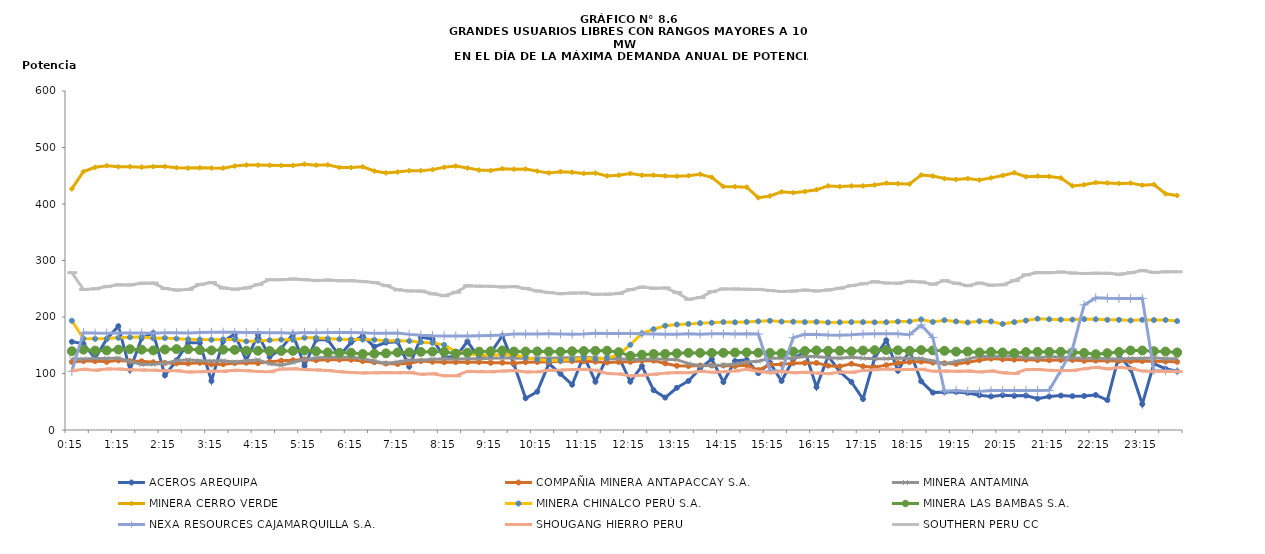
| Category | ACEROS AREQUIPA | COMPAÑIA MINERA ANTAPACCAY S.A. | MINERA ANTAMINA | MINERA CERRO VERDE | MINERA CHINALCO PERÚ S.A. | MINERA LAS BAMBAS S.A. | NEXA RESOURCES CAJAMARQUILLA S.A. | SHOUGANG HIERRO PERU | SOUTHERN PERU CC |
|---|---|---|---|---|---|---|---|---|---|
| 2013-03-14 00:15:00 | 156.19 | 120.55 | 125.65 | 426.71 | 193.35 | 139.48 | 103.99 | 105.05 | 278.43 |
| 2013-03-14 00:30:00 | 152.95 | 122.13 | 125.59 | 457.32 | 161.76 | 142.19 | 172.27 | 107.53 | 248.56 |
| 2013-03-14 00:45:00 | 126.42 | 121.96 | 126.39 | 464.91 | 161.42 | 140.56 | 171.52 | 105.78 | 249.96 |
| 2013-03-14 01:00:00 | 161.11 | 120.61 | 126.63 | 467.75 | 161.8 | 140.8 | 171.46 | 108.13 | 253.76 |
| 2013-03-14 01:15:00 | 183.74 | 123.22 | 127.4 | 466.04 | 163.17 | 142.27 | 171.75 | 107.87 | 257.07 |
| 2013-03-14 01:30:00 | 106.52 | 121.72 | 121.48 | 465.92 | 164.23 | 143.01 | 171.68 | 106.56 | 256.84 |
| 2013-03-14 01:45:00 | 162.17 | 121.72 | 116.07 | 465.22 | 164.5 | 142.21 | 171.57 | 106.04 | 259.85 |
| 2013-03-14 02:00:00 | 171.76 | 119.89 | 116.27 | 466.17 | 162.21 | 140.84 | 171.4 | 105.89 | 260.01 |
| 2013-03-14 02:15:00 | 96.72 | 118.86 | 118.07 | 466.47 | 162.93 | 142.43 | 172.02 | 104.96 | 250.38 |
| 2013-03-14 02:30:00 | 123.28 | 117.89 | 122.46 | 464.32 | 161.72 | 143.18 | 172.19 | 104.72 | 247.6 |
| 2013-03-14 02:45:00 | 154.51 | 117.76 | 124.16 | 463.55 | 160.73 | 142.98 | 171.48 | 102.72 | 248.86 |
| 2013-03-14 03:00:00 | 154.22 | 119.07 | 122.7 | 464.19 | 160.21 | 141.53 | 172.69 | 103.11 | 257.44 |
| 2013-03-14 03:15:00 | 86.91 | 116.09 | 122.02 | 463.59 | 159.76 | 140.89 | 172.8 | 103.84 | 261.07 |
| 2013-03-14 03:30:00 | 157.03 | 116.47 | 122.56 | 463.48 | 160.36 | 142.25 | 173.09 | 103.78 | 251.37 |
| 2013-03-14 03:45:00 | 169.61 | 118.28 | 120.3 | 467.12 | 160.21 | 141.85 | 172.89 | 105.71 | 249.28 |
| 2013-03-14 04:00:00 | 123.09 | 119.14 | 122.68 | 468.93 | 156.83 | 140.39 | 172.65 | 104.86 | 251.47 |
| 2013-03-14 04:15:00 | 168.83 | 118.37 | 124.44 | 468.83 | 158.13 | 140.25 | 172.38 | 103.58 | 257.35 |
| 2013-03-14 04:30:00 | 129.4 | 120.9 | 117.01 | 468.51 | 158.95 | 139.82 | 172.33 | 103.17 | 266.03 |
| 2013-03-14 04:45:00 | 144.52 | 122.64 | 114.56 | 468.16 | 159.96 | 139.95 | 172.28 | 107.76 | 266.13 |
| 2013-03-14 05:00:00 | 169.63 | 123.55 | 119.51 | 468.25 | 159.89 | 140.03 | 171.1 | 108.58 | 267.25 |
| 2013-03-14 05:15:00 | 113.55 | 124.92 | 124.83 | 470.31 | 163.35 | 140.7 | 172.66 | 106.97 | 266.02 |
| 2013-03-14 05:30:00 | 159.78 | 123.42 | 127.31 | 468.78 | 163.09 | 139.43 | 172.04 | 106.29 | 264.49 |
| 2013-03-14 05:45:00 | 159.53 | 124.33 | 129.1 | 469.33 | 161.85 | 137.3 | 172.35 | 105.16 | 265.44 |
| 2013-03-14 06:00:00 | 131.38 | 124.59 | 128.56 | 464.67 | 160.8 | 136.62 | 172.64 | 103.18 | 264.13 |
| 2013-03-14 06:15:00 | 155.05 | 124.37 | 128.67 | 464.52 | 160.35 | 136.73 | 172.52 | 101.86 | 264.27 |
| 2013-03-14 06:30:00 | 166.41 | 121.89 | 126.62 | 465.96 | 160.08 | 134.53 | 172 | 101.07 | 262.76 |
| 2013-03-14 06:45:00 | 147.44 | 119.85 | 121.71 | 458.44 | 159.62 | 134.92 | 171.02 | 101.15 | 260.88 |
| 2013-03-14 07:00:00 | 154.76 | 117.61 | 118.2 | 455.04 | 157.77 | 135.64 | 171.28 | 101.56 | 255.52 |
| 2013-03-14 07:15:00 | 156.19 | 116.82 | 120.28 | 456.79 | 157.85 | 137.21 | 171.51 | 101.23 | 248.12 |
| 2013-03-14 07:30:00 | 112.21 | 118.07 | 123.67 | 459.07 | 157.6 | 137.41 | 169.25 | 101.9 | 246.11 |
| 2013-03-14 07:45:00 | 164.05 | 122.06 | 123.36 | 459.02 | 155.37 | 138.22 | 167.55 | 98.7 | 245.87 |
| 2013-03-14 08:00:00 | 160.9 | 120.72 | 125.4 | 460.84 | 154.17 | 138.61 | 166.8 | 99.72 | 241.01 |
| 2013-03-14 08:15:00 | 129.66 | 120.02 | 125.95 | 464.96 | 150.76 | 138.46 | 166.56 | 95.88 | 237.63 |
| 2013-03-14 08:30:00 | 128.91 | 120.3 | 125.63 | 467.07 | 138.37 | 135.18 | 166.52 | 95.8 | 243.8 |
| 2013-03-14 08:45:00 | 156.73 | 120.05 | 126.1 | 463.63 | 135.17 | 136.88 | 166.47 | 103.78 | 255.35 |
| 2013-03-14 09:00:00 | 127.11 | 120.35 | 125.95 | 460.02 | 132.4 | 138.73 | 166.86 | 103.3 | 254.6 |
| 2013-03-14 09:15:00 | 136.23 | 118.9 | 127.1 | 459.29 | 132.44 | 139.44 | 167.39 | 102.96 | 254.23 |
| 2013-03-14 09:30:00 | 166.94 | 119.11 | 127.28 | 462.53 | 133.1 | 140.79 | 168.26 | 104.22 | 253.25 |
| 2013-03-14 09:45:00 | 116.25 | 118.3 | 127.6 | 461.6 | 133.68 | 138.9 | 170 | 105.1 | 253.83 |
| 2013-03-14 10:00:00 | 56.18 | 119.95 | 126.74 | 461.95 | 128.45 | 138.91 | 170.05 | 102.82 | 250.45 |
| 2013-03-14 10:15:00 | 67.79 | 120.41 | 126.91 | 458.17 | 124.86 | 139.09 | 170.03 | 102.99 | 246.08 |
| 2013-03-14 10:30:00 | 117.51 | 120.48 | 126.89 | 455.07 | 123.05 | 138.77 | 170.28 | 105.54 | 243.23 |
| 2013-03-14 10:45:00 | 99.41 | 121.84 | 127.99 | 457.26 | 123.02 | 138.48 | 170.09 | 106.02 | 241.17 |
| 2013-03-14 11:00:00 | 80.17 | 122.05 | 127.82 | 456.28 | 124.97 | 139.37 | 169.43 | 106.98 | 242.29 |
| 2013-03-14 11:15:00 | 131.13 | 121.53 | 128.17 | 454.15 | 127.09 | 139.78 | 170.06 | 107.33 | 242.69 |
| 2013-03-14 11:30:00 | 85.42 | 120.99 | 128.04 | 454.69 | 125.83 | 140.05 | 171.27 | 105.78 | 240.05 |
| 2013-03-14 11:45:00 | 128.52 | 119.62 | 126.29 | 449.67 | 127.29 | 140.35 | 170.74 | 100.18 | 240.42 |
| 2013-03-14 12:00:00 | 129.76 | 120.46 | 126.28 | 450.77 | 133.02 | 137.82 | 170.61 | 99.22 | 241.76 |
| 2013-03-14 12:15:00 | 85.55 | 120.66 | 124.97 | 454.01 | 150.89 | 131.3 | 170.62 | 95.82 | 248.48 |
| 2013-03-14 12:30:00 | 113.06 | 122.47 | 124.93 | 450.93 | 170.99 | 133.33 | 170.14 | 96.94 | 253.01 |
| 2013-03-14 12:45:00 | 70.49 | 122.72 | 126.12 | 450.89 | 178.34 | 134.49 | 169.98 | 98.61 | 250.88 |
| 2013-03-14 13:00:00 | 57.37 | 117.81 | 125.41 | 449.72 | 184.53 | 134.72 | 169.47 | 100.67 | 251.41 |
| 2013-03-14 13:15:00 | 74.64 | 113.65 | 124.45 | 449.21 | 186.71 | 135.7 | 169.46 | 101.69 | 243.15 |
| 2013-03-14 13:30:00 | 86.84 | 113.18 | 117.46 | 450.11 | 187.8 | 136.54 | 170.28 | 101.52 | 231.47 |
| 2013-03-14 13:45:00 | 109.07 | 114.24 | 113.75 | 452.67 | 189.16 | 136.46 | 169.68 | 103.94 | 234.54 |
| 2013-03-14 14:00:00 | 125.54 | 114.09 | 114.06 | 447.35 | 189.78 | 136.48 | 170.29 | 102.02 | 244.88 |
| 2013-03-14 14:15:00 | 84.88 | 114.15 | 114.99 | 430.9 | 190.97 | 136.59 | 170.33 | 103.24 | 249.71 |
| 2013-03-14 14:30:00 | 122.09 | 113.1 | 116.81 | 430.69 | 190.57 | 137.02 | 169.95 | 104.61 | 249.52 |
| 2013-03-14 14:45:00 | 124.23 | 114.44 | 120.56 | 429.85 | 191.3 | 137.31 | 170.29 | 107.5 | 249.17 |
| 2013-03-14 15:00:00 | 100.56 | 106.12 | 121.88 | 411.13 | 192.33 | 136.77 | 169.9 | 103.39 | 248.89 |
| 2013-03-14 15:15:00 | 118.98 | 115.45 | 126.83 | 414.1 | 193.33 | 136.35 | 105.45 | 101.15 | 246.9 |
| 2013-03-14 15:30:00 | 86.84 | 116.16 | 127.42 | 421.54 | 191.88 | 135.93 | 103.8 | 103.71 | 245.09 |
| 2013-03-14 15:45:00 | 124.87 | 118.33 | 127.04 | 420.07 | 191.62 | 138.75 | 163.44 | 101.17 | 245.95 |
| 2013-03-14 16:00:00 | 139.57 | 118.57 | 130.39 | 422.08 | 190.94 | 139.83 | 169.39 | 102.29 | 247.56 |
| 2013-03-14 16:15:00 | 75.88 | 118.76 | 130.07 | 425.34 | 191.43 | 140.85 | 169.14 | 100.7 | 246.1 |
| 2013-03-14 16:30:00 | 130.69 | 113.87 | 127.86 | 432.03 | 190.35 | 140.18 | 168.06 | 99.63 | 247.92 |
| 2013-03-14 16:45:00 | 103.07 | 112.59 | 127.19 | 430.88 | 190.67 | 140.17 | 167.84 | 102.61 | 250.96 |
| 2013-03-14 17:00:00 | 85.04 | 117.29 | 128.83 | 432.05 | 190.96 | 139.25 | 168.4 | 102.09 | 255.55 |
| 2013-03-14 17:15:00 | 54.91 | 112.73 | 127.04 | 431.97 | 190.94 | 140.65 | 169.98 | 105.18 | 258.67 |
| 2013-03-14 17:30:00 | 127.76 | 111.05 | 125.95 | 433.74 | 190.55 | 141.26 | 170.48 | 106.72 | 262.53 |
| 2013-03-14 17:45:00 | 158.9 | 114.79 | 126.07 | 436.88 | 190.75 | 141.57 | 170.34 | 108.02 | 260.18 |
| 2013-03-14 18:00:00 | 104.88 | 118.49 | 127.24 | 436.05 | 191.94 | 141.02 | 170.16 | 107.15 | 259.81 |
| 2013-03-14 18:15:00 | 140.47 | 120.38 | 126.88 | 435.36 | 192.11 | 140.04 | 168.68 | 107.14 | 263.26 |
| 2013-03-14 18:30:00 | 86.17 | 121.15 | 126.4 | 451.31 | 195.67 | 141.42 | 185.83 | 107.61 | 262 |
| 2013-03-14 18:45:00 | 66.18 | 119.19 | 122.17 | 449.38 | 191.23 | 140.83 | 163.78 | 104.06 | 257.99 |
| 2013-03-14 19:00:00 | 67.42 | 118.19 | 117.4 | 445.01 | 194.37 | 140.11 | 68.38 | 104.41 | 264.27 |
| 2013-03-14 19:15:00 | 67.42 | 117.03 | 121.43 | 443.32 | 192.18 | 138.69 | 70.05 | 103.79 | 259.69 |
| 2013-03-14 19:30:00 | 65.64 | 119.87 | 125.45 | 445.08 | 190.33 | 138.79 | 68.19 | 104.52 | 255.52 |
| 2013-03-14 19:45:00 | 61.56 | 123.57 | 130.59 | 442.59 | 192.53 | 137.38 | 68.01 | 102.84 | 260.09 |
| 2013-03-14 20:00:00 | 59.43 | 126.36 | 129.99 | 446.21 | 192.21 | 138.26 | 69.71 | 104.56 | 256.21 |
| 2013-03-14 20:15:00 | 61.49 | 125.1 | 130.56 | 450.51 | 187.74 | 137.34 | 69.75 | 101.18 | 257.11 |
| 2013-03-14 20:30:00 | 60.44 | 124.55 | 130.99 | 455.37 | 190.97 | 136.07 | 69.88 | 99.89 | 264.32 |
| 2013-03-14 20:45:00 | 61.01 | 124.55 | 127.95 | 448.26 | 193.76 | 137.96 | 69.98 | 106.94 | 274.59 |
| 2013-03-14 21:00:00 | 55.51 | 123.81 | 127.47 | 449.19 | 197.01 | 138.26 | 69.74 | 107.13 | 278.64 |
| 2013-03-14 21:15:00 | 59.23 | 123.51 | 129.94 | 448.76 | 195.97 | 138.3 | 70.13 | 105.72 | 278.48 |
| 2013-03-14 21:30:00 | 60.89 | 123.91 | 128.77 | 446.07 | 195.34 | 138.47 | 105.47 | 105.14 | 279.69 |
| 2013-03-14 21:45:00 | 59.86 | 123.92 | 127.72 | 431.98 | 195.45 | 137.47 | 143.53 | 105.48 | 277.8 |
| 2013-03-14 22:00:00 | 60.16 | 122.47 | 127.52 | 434.03 | 196.27 | 136.48 | 221.42 | 108.32 | 276.93 |
| 2013-03-14 22:15:00 | 61.95 | 122.89 | 126.87 | 438 | 195.98 | 134.13 | 233.89 | 110.91 | 277.48 |
| 2013-03-14 22:30:00 | 52.88 | 122.64 | 126.01 | 437.05 | 194.97 | 136.05 | 233.06 | 108.21 | 277.31 |
| 2013-03-14 22:45:00 | 131.94 | 122.28 | 125.6 | 436.46 | 195 | 138.1 | 232.81 | 111.1 | 275.68 |
| 2013-03-14 23:00:00 | 107.78 | 121.51 | 126.54 | 436.93 | 193.81 | 140.67 | 232.9 | 108.97 | 278.43 |
| 2013-03-14 23:15:00 | 45.86 | 122.05 | 126.74 | 433.23 | 195.05 | 140.71 | 232.96 | 104.5 | 282.41 |
| 2013-03-14 23:30:00 | 117.53 | 121.49 | 127.83 | 434.35 | 194.56 | 139.46 | 105.07 | 103.64 | 278.91 |
| 2013-03-14 23:45:00 | 108.37 | 121.17 | 126.2 | 418.08 | 194.69 | 138.86 | 104.78 | 103.65 | 279.87 |
| 2013-03-15 | 103.93 | 120.65 | 125.94 | 414.91 | 192.72 | 137.28 | 104.34 | 103.37 | 280.03 |